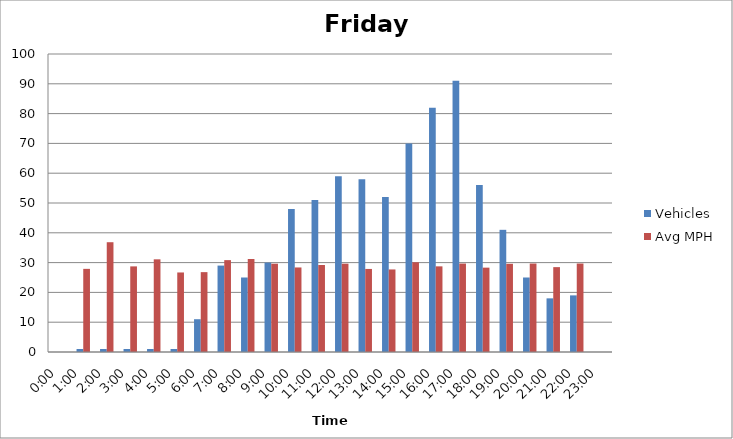
| Category | Vehicles | Avg MPH |
|---|---|---|
| 0:00 | 0 | 0 |
| 1:00 | 1 | 27.9 |
| 2:00 | 1 | 36.84 |
| 3:00 | 1 | 28.73 |
| 4:00 | 1 | 31.1 |
| 5:00 | 1 | 26.69 |
| 6:00 | 11 | 26.8 |
| 7:00 | 29 | 30.83 |
| 8:00 | 25 | 31.2 |
| 9:00 | 30 | 29.63 |
| 10:00 | 48 | 28.37 |
| 11:00 | 51 | 29.19 |
| 12:00 | 59 | 29.64 |
| 13:00 | 58 | 27.87 |
| 14:00 | 52 | 27.7 |
| 15:00 | 70 | 30.11 |
| 16:00 | 82 | 28.74 |
| 17:00 | 91 | 29.68 |
| 18:00 | 56 | 28.31 |
| 19:00 | 41 | 29.6 |
| 20:00 | 25 | 29.69 |
| 21:00 | 18 | 28.48 |
| 22:00 | 19 | 29.69 |
| 23:00 | 0 | 0 |